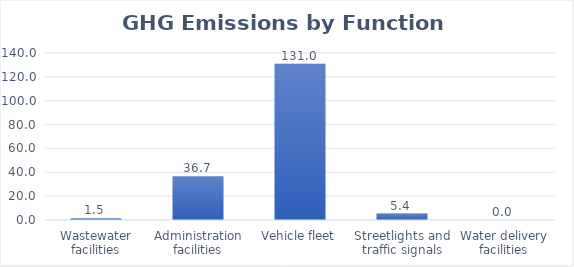
| Category | GHG Emissions (tons) |
|---|---|
| Wastewater facilities | 1.541 |
| Administration facilities | 36.653 |
| Vehicle fleet | 131.002 |
| Streetlights and traffic signals | 5.437 |
| Water delivery facilities | 0 |